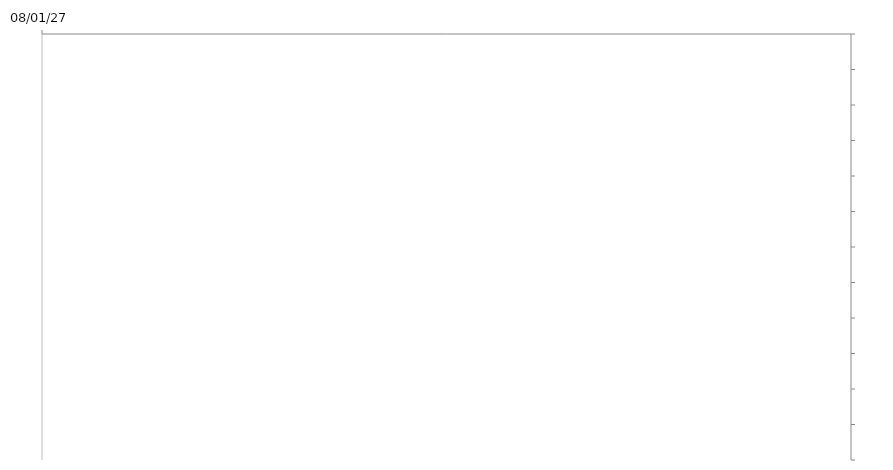
| Category | START DATE | DURATION IN DAYS |
|---|---|---|
|  |  | 0 |
|  |  | 0 |
|  |  | 0 |
|  |  | 0 |
|  |  | 0 |
|  |  | 0 |
|  |  | 0 |
|  |  | 0 |
|  |  | 0 |
|  |  | 0 |
|  |  | 0 |
|  |  | 0 |